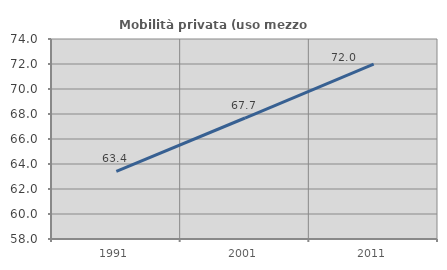
| Category | Mobilità privata (uso mezzo privato) |
|---|---|
| 1991.0 | 63.416 |
| 2001.0 | 67.679 |
| 2011.0 | 71.989 |